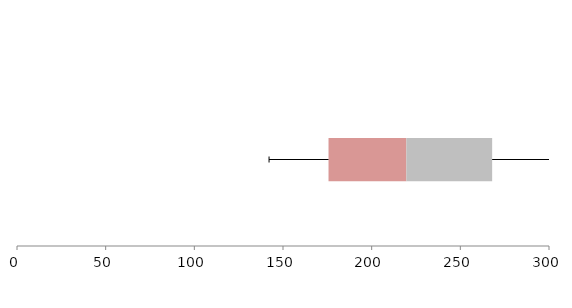
| Category | Series 1 | Series 2 | Series 3 |
|---|---|---|---|
| 0 | 175.673 | 43.902 | 48.37 |